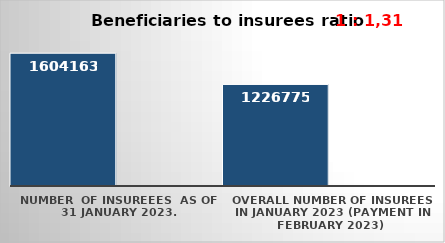
| Category | Series 0 | Series 1 |
|---|---|---|
| NUMBER  of insureees  as of  31 January 2023. | 1604163 |  |
| OVERALL number of insurees in January 2023 (payment in February 2023) | 1226775 |  |